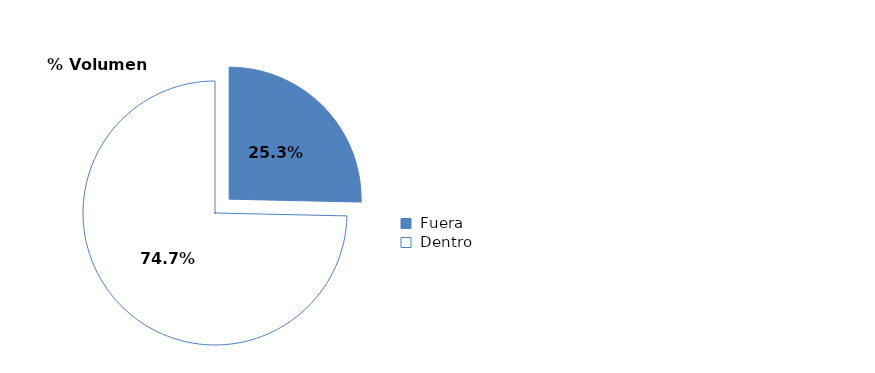
| Category | Series 0 | Series 1 | Series 2 | Series 3 | Series 4 |
|---|---|---|---|---|---|
| Fuera | 0.253 | 0 | 0.253 | 0 | 0.253 |
| Dentro | 0.747 | 0 | 0.747 | 0 | 0.747 |